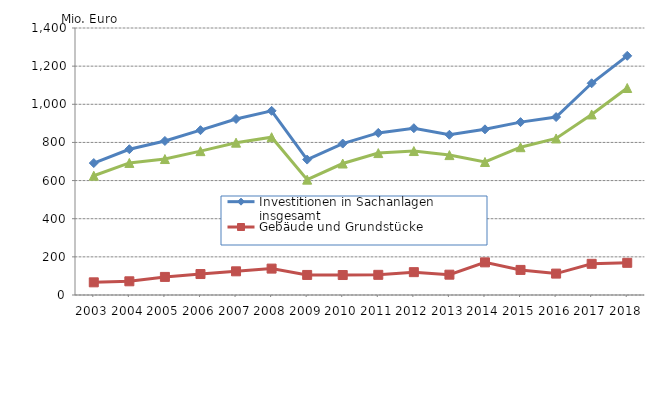
| Category | Investitionen in Sachanlagen insgesamt | Gebäude und Grundstücke | Maschinen und Betriebsausstattung |
|---|---|---|---|
| 2003.0 | 691840 | 66441 | 625399 |
| 2004.0 | 764337 | 71810 | 692527 |
| 2005.0 | 807730 | 94864 | 712866 |
| 2006.0 | 864202 | 109907 | 754295 |
| 2007.0 | 922931 | 124199 | 798732 |
| 2008.0 | 965705 | 138389 | 827316 |
| 2009.0 | 710022 | 105189 | 604833 |
| 2010.0 | 794111 | 104710 | 689400 |
| 2011.0 | 849848.946 | 105760 | 744088.575 |
| 2012.0 | 874647.991 | 119797 | 754850.66 |
| 2013.0 | 840136.552 | 106586 | 733550.844 |
| 2014.0 | 868614.61 | 171128 | 697486.539 |
| 2015.0 | 906511.133 | 131559.378 | 774951.755 |
| 2016.0 | 933005.993 | 112203.211 | 820802.782 |
| 2017.0 | 1110213.856 | 163523.751 | 946690.105 |
| 2018.0 | 1254089.769 | 168719.773 | 1085369.996 |